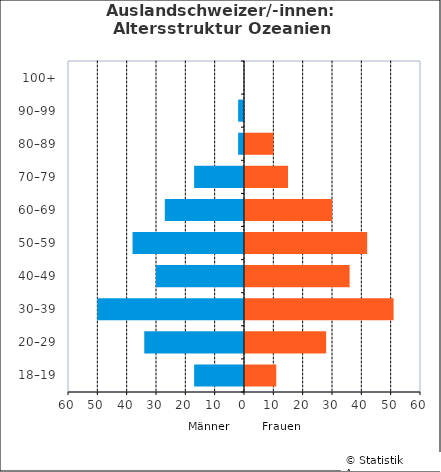
| Category | Männer | Frauen |
|---|---|---|
| 18–19 | -17 | 11 |
| 20–29 | -34 | 28 |
| 30–39 | -50 | 51 |
| 40–49 | -30 | 36 |
| 50–59 | -38 | 42 |
| 60–69 | -27 | 30 |
| 70–79 | -17 | 15 |
| 80–89 | -2 | 10 |
| 90–99 | -2 | 0 |
| 100+ | 0 | 0 |